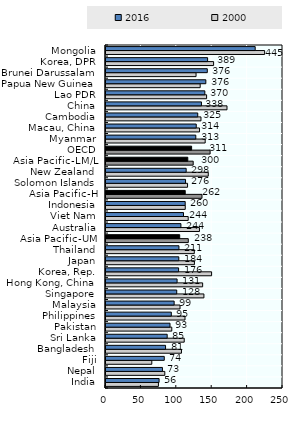
| Category | 2000 | 2016 |
|---|---|---|
| India | 74.051 | 74.99 |
| Nepal | 83.06 | 79.736 |
| Fiji | 64.696 | 82.308 |
| Bangladesh | 106.587 | 84.114 |
| Sri Lanka | 110.484 | 86.414 |
| Pakistan | 92.915 | 90.41 |
| Philippines | 111.594 | 92.26 |
| Malaysia | 104.543 | 96.262 |
| Singapore | 138.296 | 99.899 |
| Hong Kong, China | 136.5 | 100.4 |
| Korea, Rep. | 149.148 | 102.526 |
| Japan | 124.868 | 102.838 |
| Thailand | 124.711 | 103.023 |
| Asia Pacific-UM | 116.217 | 104.105 |
| Australia | 132.012 | 105.804 |
| Viet Nam | 116.106 | 109.472 |
| Indonesia | 111.952 | 111.854 |
| Asia Pacific-H | 135.573 | 111.905 |
| Solomon Islands | 115.194 | 112.35 |
| New Zealand | 144.459 | 113.22 |
| Asia Pacific-LM/L | 123.154 | 115.523 |
| OECD | 147.066 | 120.92 |
| Myanmar | 140.088 | 126.84 |
| Macau, China | 132.097 | 127.462 |
| Cambodia | 134.146 | 129.574 |
| China | 170.918 | 134.828 |
| Lao PDR | 142.087 | 139.605 |
| Papua New Guinea | 133.013 | 141.005 |
| Brunei Darussalam | 127.199 | 143.088 |
| Korea, DPR | 151.971 | 143.496 |
| Mongolia | 224.067 | 210.718 |